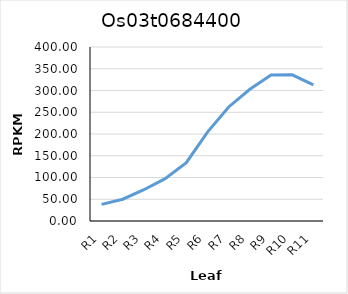
| Category | Os03t0684400 |
|---|---|
| R1 | 38.135 |
| R2 | 50.049 |
| R3 | 71.877 |
| R4 | 97.38 |
| R5 | 134.168 |
| R6 | 204.333 |
| R7 | 262.133 |
| R8 | 302.83 |
| R9 | 335.361 |
| R10 | 336.072 |
| R11 | 313.094 |